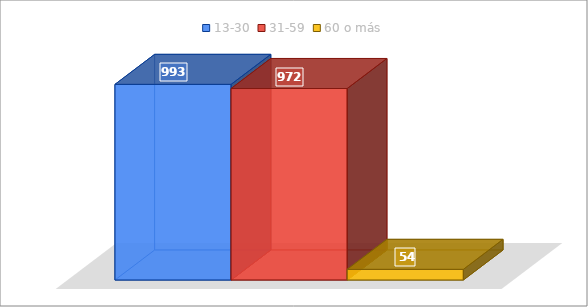
| Category | 13-30 | 31-59 | 60 o más |
|---|---|---|---|
| 0 | 993 | 972 | 54 |